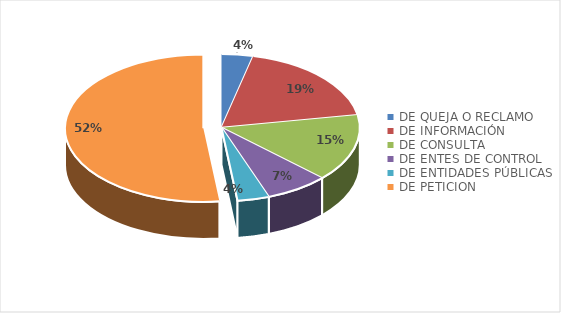
| Category | Series 0 |
|---|---|
| DE QUEJA O RECLAMO | 1 |
| DE INFORMACIÓN | 5 |
| DE CONSULTA | 4 |
| DE ENTES DE CONTROL | 2 |
| DE ENTIDADES PÚBLICAS | 1 |
| DE PETICION | 14 |